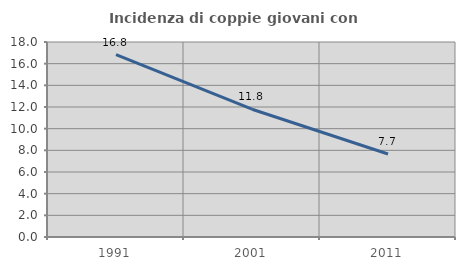
| Category | Incidenza di coppie giovani con figli |
|---|---|
| 1991.0 | 16.835 |
| 2001.0 | 11.796 |
| 2011.0 | 7.658 |